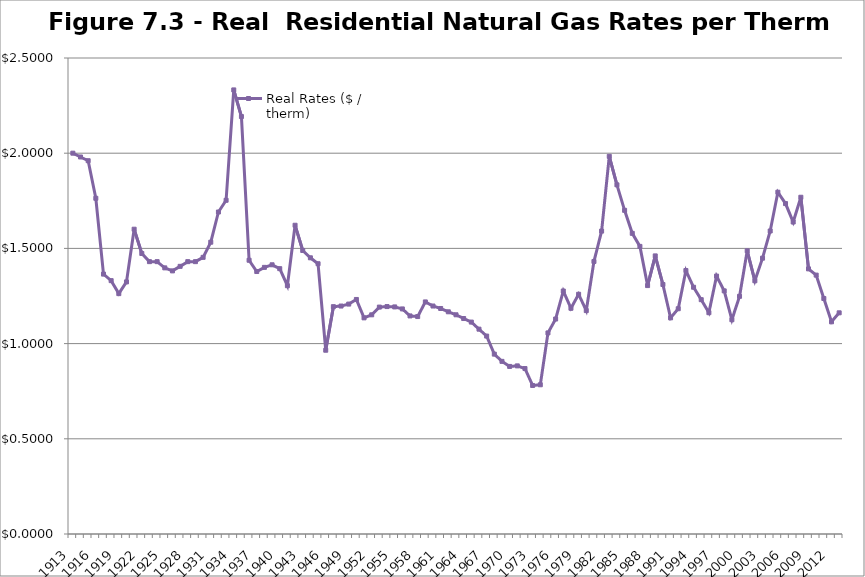
| Category | Real Rates ($ / therm) |
|---|---|
| 1913.0 | 2 |
| 1914.0 | 1.98 |
| 1915.0 | 1.961 |
| 1916.0 | 1.763 |
| 1917.0 | 1.365 |
| 1918.0 | 1.331 |
| 1919.0 | 1.262 |
| 1920.0 | 1.324 |
| 1921.0 | 1.601 |
| 1922.0 | 1.473 |
| 1923.0 | 1.43 |
| 1924.0 | 1.43 |
| 1925.0 | 1.398 |
| 1926.0 | 1.382 |
| 1927.0 | 1.406 |
| 1928.0 | 1.43 |
| 1929.0 | 1.43 |
| 1930.0 | 1.453 |
| 1931.0 | 1.533 |
| 1932.0 | 1.691 |
| 1933.0 | 1.753 |
| 1934.0 | 2.332 |
| 1935.0 | 2.192 |
| 1936.0 | 1.438 |
| 1937.0 | 1.379 |
| 1938.0 | 1.4 |
| 1939.0 | 1.414 |
| 1940.0 | 1.394 |
| 1941.0 | 1.304 |
| 1942.0 | 1.622 |
| 1943.0 | 1.489 |
| 1944.0 | 1.451 |
| 1945.0 | 1.419 |
| 1946.0 | 0.965 |
| 1947.0 | 1.194 |
| 1948.0 | 1.197 |
| 1949.0 | 1.208 |
| 1950.0 | 1.232 |
| 1951.0 | 1.135 |
| 1952.0 | 1.151 |
| 1953.0 | 1.192 |
| 1954.0 | 1.194 |
| 1955.0 | 1.193 |
| 1956.0 | 1.182 |
| 1957.0 | 1.145 |
| 1958.0 | 1.142 |
| 1959.0 | 1.219 |
| 1960.0 | 1.197 |
| 1961.0 | 1.184 |
| 1962.0 | 1.167 |
| 1963.0 | 1.151 |
| 1964.0 | 1.132 |
| 1965.0 | 1.113 |
| 1966.0 | 1.076 |
| 1967.0 | 1.039 |
| 1968.0 | 0.945 |
| 1969.0 | 0.907 |
| 1970.0 | 0.88 |
| 1971.0 | 0.883 |
| 1972.0 | 0.869 |
| 1973.0 | 0.78 |
| 1974.0 | 0.784 |
| 1975.0 | 1.056 |
| 1976.0 | 1.129 |
| 1977.0 | 1.276 |
| 1978.0 | 1.186 |
| 1979.0 | 1.259 |
| 1980.0 | 1.173 |
| 1981.0 | 1.431 |
| 1982.0 | 1.591 |
| 1983.0 | 1.984 |
| 1984.0 | 1.834 |
| 1985.0 | 1.7 |
| 1986.0 | 1.579 |
| 1987.0 | 1.511 |
| 1988.0 | 1.305 |
| 1989.0 | 1.461 |
| 1990.0 | 1.31 |
| 1991.0 | 1.135 |
| 1992.0 | 1.183 |
| 1993.0 | 1.384 |
| 1994.0 | 1.296 |
| 1995.0 | 1.231 |
| 1996.0 | 1.162 |
| 1997.0 | 1.355 |
| 1998.0 | 1.277 |
| 1999.0 | 1.125 |
| 2000.0 | 1.248 |
| 2001.0 | 1.487 |
| 2002.0 | 1.33 |
| 2003.0 | 1.449 |
| 2004.0 | 1.591 |
| 2005.0 | 1.795 |
| 2006.0 | 1.735 |
| 2007.0 | 1.639 |
| 2008.0 | 1.769 |
| 2009.0 | 1.393 |
| 2010.0 | 1.36 |
| 2011.0 | 1.237 |
| 2012.0 | 1.114 |
| 2013.0 | 1.162 |